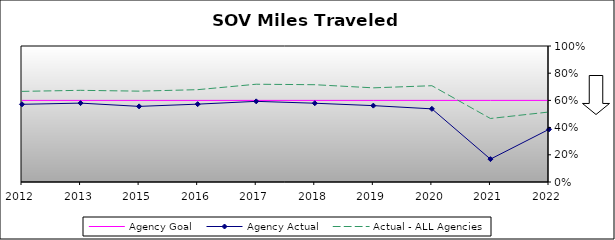
| Category | Agency Goal | Agency Actual | Actual - ALL Agencies |
|---|---|---|---|
| 2012.0 | 0.6 | 0.571 | 0.666 |
| 2013.0 | 0.6 | 0.58 | 0.674 |
| 2015.0 | 0.6 | 0.556 | 0.668 |
| 2016.0 | 0.6 | 0.572 | 0.679 |
| 2017.0 | 0.6 | 0.593 | 0.719 |
| 2018.0 | 0.6 | 0.579 | 0.715 |
| 2019.0 | 0.6 | 0.562 | 0.692 |
| 2020.0 | 0.6 | 0.538 | 0.708 |
| 2021.0 | 0.6 | 0.168 | 0.467 |
| 2022.0 | 0.6 | 0.387 | 0.515 |